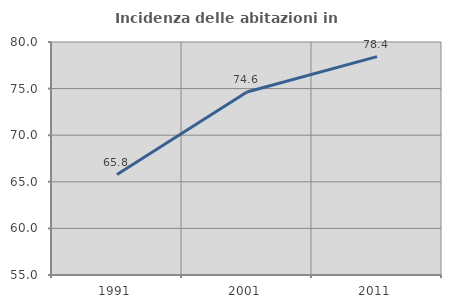
| Category | Incidenza delle abitazioni in proprietà  |
|---|---|
| 1991.0 | 65.782 |
| 2001.0 | 74.634 |
| 2011.0 | 78.426 |